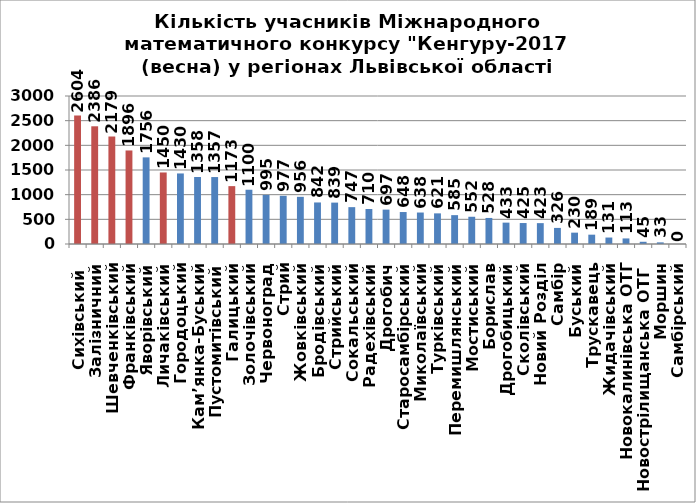
| Category | Р |
|---|---|
| Сихівський  | 2604 |
| Залізничний | 2386 |
| Шевченківський | 2179 |
| Франківський | 1896 |
| Яворівський | 1756 |
| Личаківський | 1450 |
| Городоцький | 1430 |
| Кам’янка-Буський | 1358 |
| Пустомитівський | 1357 |
| Галицький | 1173 |
| Золочівський | 1100 |
| Червоноград | 995 |
| Стрий | 977 |
| Жовківський | 956 |
| Бродівський | 842 |
| Стрийський | 839 |
| Сокальський | 747 |
| Радехівський | 710 |
| Дрогобич | 697 |
| Старосамбірський | 648 |
| Миколаївський | 638 |
| Турківський | 621 |
| Перемишлянський | 585 |
| Мостиський | 552 |
| Борислав | 528 |
| Дрогобицький | 433 |
| Сколівський | 425 |
| Новий Розділ | 423 |
| Самбір | 326 |
| Буський | 230 |
| Трускавець | 189 |
| Жидачівський | 131 |
| Новокалинівська ОТГ | 113 |
| Новострілищанська ОТГ  | 45 |
| Моршин | 33 |
| Самбірський | 0 |